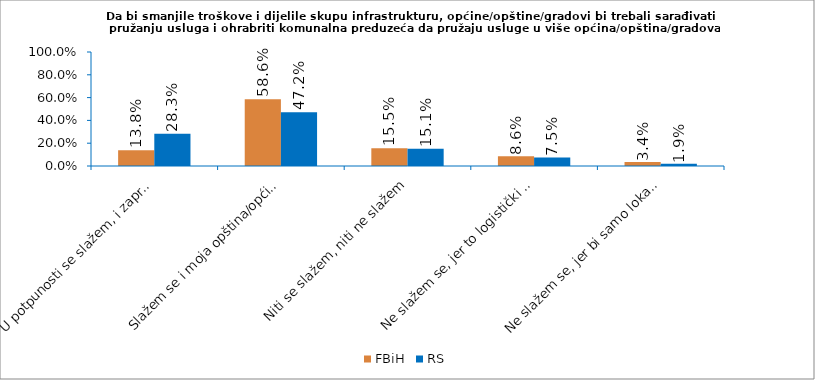
| Category | FBiH | RS |
|---|---|---|
| U potpunosti se slažem, i zapravo već sarađujemo u tavkoj šemi | 0.138 | 0.283 |
| Slažem se i moja opština/općina/grad bi razmotrila saradnju u takvoj šemi | 0.586 | 0.472 |
| Niti se slažem, niti ne slažem | 0.155 | 0.151 |
| Ne slažem se, jer to logistički nije moguće u mojoj opštini/općini/gradu | 0.086 | 0.075 |
| Ne slažem se, jer bi samo lokalne opštine/općine/gradovi trebale da pružaju lokalne usluge | 0.034 | 0.019 |